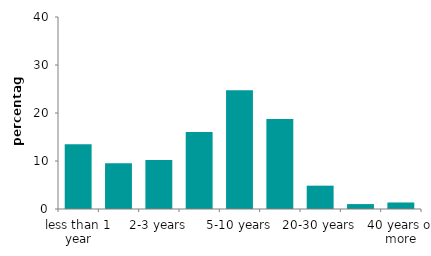
| Category | Series 0 |
|---|---|
| less than 1 year | 13.482 |
| 1-2 years | 9.542 |
| 2-3 years | 10.218 |
| 3-5 years | 16.023 |
| 5-10 years | 24.765 |
| 10-20 years | 18.724 |
| 20-30 years | 4.861 |
| 30-40 years | 1.025 |
| 40 years or more | 1.359 |